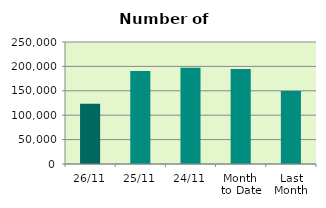
| Category | Series 0 |
|---|---|
| 26/11 | 123432 |
| 25/11 | 190520 |
| 24/11 | 197014 |
| Month 
to Date | 194904.632 |
| Last
Month | 149554.818 |